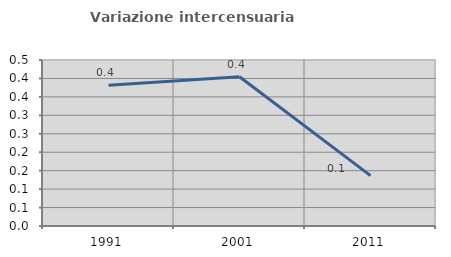
| Category | Variazione intercensuaria annua |
|---|---|
| 1991.0 | 0.382 |
| 2001.0 | 0.405 |
| 2011.0 | 0.137 |